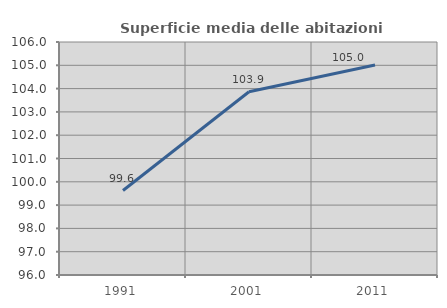
| Category | Superficie media delle abitazioni occupate |
|---|---|
| 1991.0 | 99.626 |
| 2001.0 | 103.865 |
| 2011.0 | 105.01 |